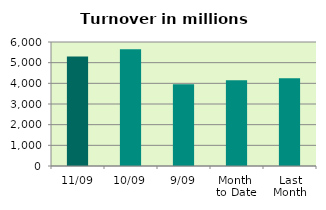
| Category | Series 0 |
|---|---|
| 11/09 | 5295.83 |
| 10/09 | 5653.921 |
| 9/09 | 3952.97 |
| Month 
to Date | 4150.398 |
| Last
Month | 4240.294 |